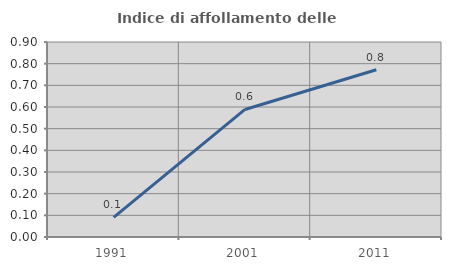
| Category | Indice di affollamento delle abitazioni  |
|---|---|
| 1991.0 | 0.09 |
| 2001.0 | 0.589 |
| 2011.0 | 0.772 |